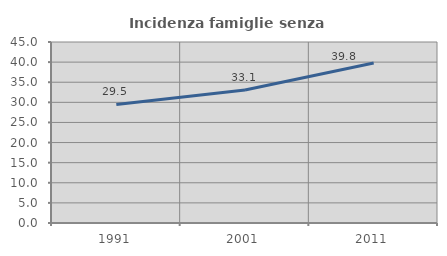
| Category | Incidenza famiglie senza nuclei |
|---|---|
| 1991.0 | 29.488 |
| 2001.0 | 33.058 |
| 2011.0 | 39.775 |